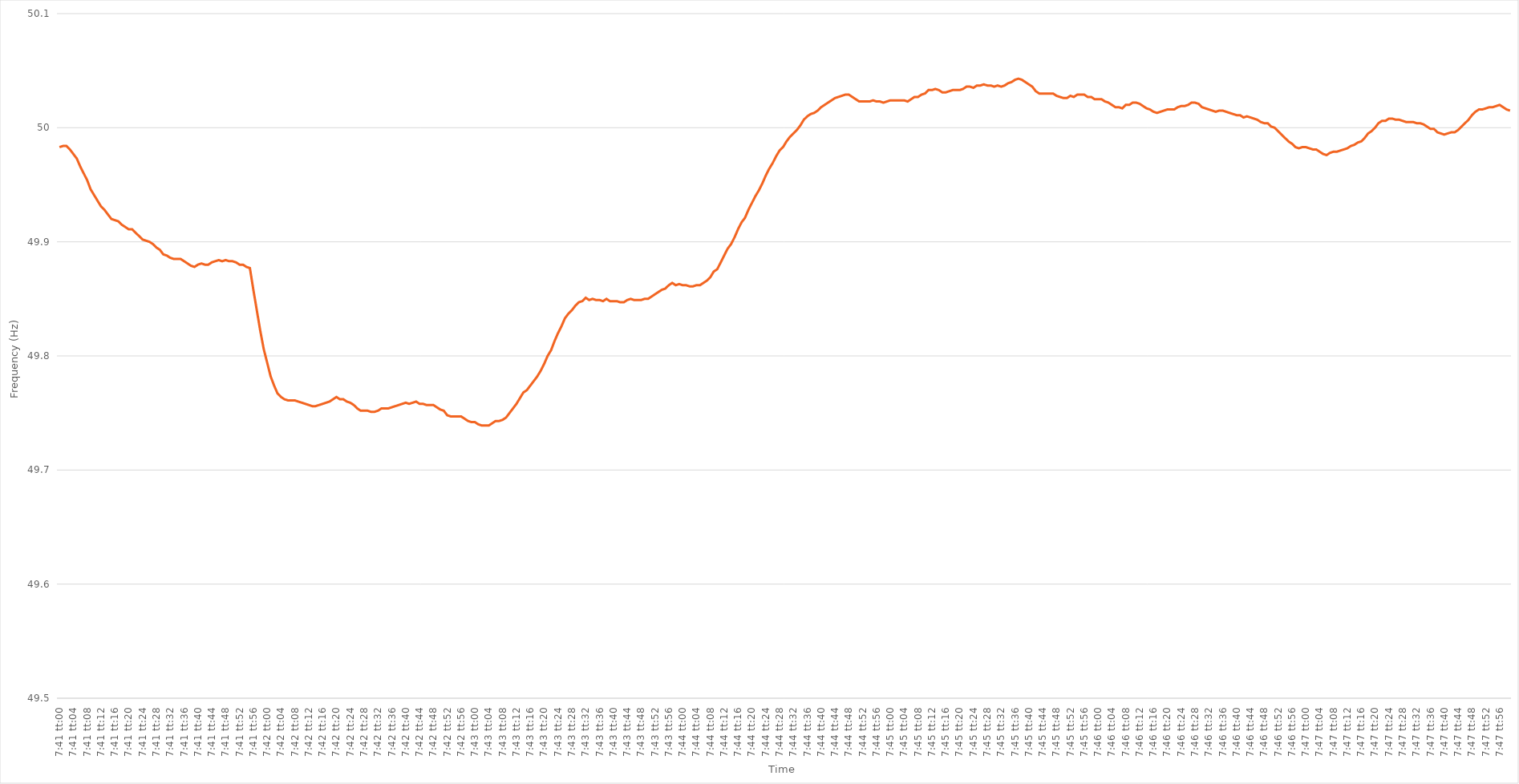
| Category | Series 0 |
|---|---|
| 0.3201388888888889 | 49.983 |
| 0.32015046296296296 | 49.984 |
| 0.32016203703703705 | 49.984 |
| 0.3201736111111111 | 49.981 |
| 0.3201851851851852 | 49.977 |
| 0.3201967592592592 | 49.973 |
| 0.3202083333333334 | 49.966 |
| 0.3202199074074074 | 49.96 |
| 0.32023148148148145 | 49.954 |
| 0.32024305555555554 | 49.946 |
| 0.32025462962962964 | 49.941 |
| 0.3202662037037037 | 49.936 |
| 0.3202777777777778 | 49.931 |
| 0.32028935185185187 | 49.928 |
| 0.3203009259259259 | 49.924 |
| 0.3203125 | 49.92 |
| 0.3203240740740741 | 49.919 |
| 0.32033564814814813 | 49.918 |
| 0.3203472222222222 | 49.915 |
| 0.3203587962962963 | 49.913 |
| 0.32037037037037036 | 49.911 |
| 0.32038194444444446 | 49.911 |
| 0.32039351851851855 | 49.908 |
| 0.3204050925925926 | 49.905 |
| 0.3204166666666666 | 49.902 |
| 0.3204282407407408 | 49.901 |
| 0.3204398148148148 | 49.9 |
| 0.3204513888888889 | 49.898 |
| 0.32046296296296295 | 49.895 |
| 0.32047453703703704 | 49.893 |
| 0.3204861111111111 | 49.889 |
| 0.3204976851851852 | 49.888 |
| 0.32050925925925927 | 49.886 |
| 0.3205208333333333 | 49.885 |
| 0.3205324074074074 | 49.885 |
| 0.3205439814814815 | 49.885 |
| 0.32055555555555554 | 49.883 |
| 0.32056712962962963 | 49.881 |
| 0.3205787037037037 | 49.879 |
| 0.32059027777777777 | 49.878 |
| 0.32060185185185186 | 49.88 |
| 0.32061342592592595 | 49.881 |
| 0.320625 | 49.88 |
| 0.3206365740740741 | 49.88 |
| 0.3206481481481482 | 49.882 |
| 0.3206597222222222 | 49.883 |
| 0.3206712962962963 | 49.884 |
| 0.32068287037037035 | 49.883 |
| 0.32069444444444445 | 49.884 |
| 0.3207060185185185 | 49.883 |
| 0.3207175925925926 | 49.883 |
| 0.3207291666666667 | 49.882 |
| 0.3207407407407407 | 49.88 |
| 0.3207523148148148 | 49.88 |
| 0.3207638888888889 | 49.878 |
| 0.32077546296296294 | 49.877 |
| 0.32078703703703704 | 49.858 |
| 0.32079861111111113 | 49.84 |
| 0.32081018518518517 | 49.822 |
| 0.32082175925925926 | 49.806 |
| 0.32083333333333336 | 49.794 |
| 0.3208449074074074 | 49.782 |
| 0.3208564814814815 | 49.774 |
| 0.3208680555555556 | 49.767 |
| 0.3208796296296296 | 49.764 |
| 0.3208912037037037 | 49.762 |
| 0.32090277777777776 | 49.761 |
| 0.32091435185185185 | 49.761 |
| 0.3209259259259259 | 49.761 |
| 0.3209375 | 49.76 |
| 0.3209490740740741 | 49.759 |
| 0.3209606481481481 | 49.758 |
| 0.3209722222222222 | 49.757 |
| 0.3209837962962963 | 49.756 |
| 0.32099537037037035 | 49.756 |
| 0.32100694444444444 | 49.757 |
| 0.32101851851851854 | 49.758 |
| 0.3210300925925926 | 49.759 |
| 0.32104166666666667 | 49.76 |
| 0.32105324074074076 | 49.762 |
| 0.3210648148148148 | 49.764 |
| 0.3210763888888889 | 49.762 |
| 0.321087962962963 | 49.762 |
| 0.32109953703703703 | 49.76 |
| 0.3211111111111111 | 49.759 |
| 0.32112268518518516 | 49.757 |
| 0.32113425925925926 | 49.754 |
| 0.3211458333333333 | 49.752 |
| 0.32115740740740745 | 49.752 |
| 0.3211689814814815 | 49.752 |
| 0.3211805555555555 | 49.751 |
| 0.3211921296296296 | 49.751 |
| 0.3212037037037037 | 49.752 |
| 0.32121527777777775 | 49.754 |
| 0.32122685185185185 | 49.754 |
| 0.32123842592592594 | 49.754 |
| 0.32125 | 49.755 |
| 0.3212615740740741 | 49.756 |
| 0.32127314814814817 | 49.757 |
| 0.3212847222222222 | 49.758 |
| 0.3212962962962963 | 49.759 |
| 0.3213078703703704 | 49.758 |
| 0.32131944444444444 | 49.759 |
| 0.32133101851851853 | 49.76 |
| 0.3213425925925926 | 49.758 |
| 0.32135416666666666 | 49.758 |
| 0.3213657407407407 | 49.757 |
| 0.32137731481481485 | 49.757 |
| 0.3213888888888889 | 49.757 |
| 0.321400462962963 | 49.755 |
| 0.321412037037037 | 49.753 |
| 0.3214236111111111 | 49.752 |
| 0.32143518518518516 | 49.748 |
| 0.32144675925925925 | 49.747 |
| 0.32145833333333335 | 49.747 |
| 0.3214699074074074 | 49.747 |
| 0.3214814814814815 | 49.747 |
| 0.3214930555555556 | 49.745 |
| 0.3215046296296296 | 49.743 |
| 0.3215162037037037 | 49.742 |
| 0.3215277777777778 | 49.742 |
| 0.32153935185185184 | 49.74 |
| 0.32155092592592593 | 49.739 |
| 0.32156250000000003 | 49.739 |
| 0.32157407407407407 | 49.739 |
| 0.32158564814814816 | 49.741 |
| 0.32159722222222226 | 49.743 |
| 0.3216087962962963 | 49.743 |
| 0.3216203703703704 | 49.744 |
| 0.32163194444444443 | 49.746 |
| 0.3216435185185185 | 49.75 |
| 0.32165509259259256 | 49.754 |
| 0.32166666666666666 | 49.758 |
| 0.32167824074074075 | 49.763 |
| 0.3216898148148148 | 49.768 |
| 0.3217013888888889 | 49.77 |
| 0.321712962962963 | 49.774 |
| 0.321724537037037 | 49.778 |
| 0.3217361111111111 | 49.782 |
| 0.3217476851851852 | 49.787 |
| 0.32175925925925924 | 49.793 |
| 0.32177083333333334 | 49.8 |
| 0.32178240740740743 | 49.805 |
| 0.3217939814814815 | 49.813 |
| 0.32180555555555557 | 49.82 |
| 0.32181712962962966 | 49.826 |
| 0.3218287037037037 | 49.833 |
| 0.3218402777777778 | 49.837 |
| 0.32185185185185183 | 49.84 |
| 0.32186342592592593 | 49.844 |
| 0.32187499999999997 | 49.847 |
| 0.32188657407407406 | 49.848 |
| 0.32189814814814816 | 49.851 |
| 0.3219097222222222 | 49.849 |
| 0.3219212962962963 | 49.85 |
| 0.3219328703703704 | 49.849 |
| 0.3219444444444444 | 49.849 |
| 0.3219560185185185 | 49.848 |
| 0.3219675925925926 | 49.85 |
| 0.32197916666666665 | 49.848 |
| 0.32199074074074074 | 49.848 |
| 0.32200231481481484 | 49.848 |
| 0.3220138888888889 | 49.847 |
| 0.32202546296296297 | 49.847 |
| 0.32203703703703707 | 49.849 |
| 0.3220486111111111 | 49.85 |
| 0.3220601851851852 | 49.849 |
| 0.32207175925925924 | 49.849 |
| 0.32208333333333333 | 49.849 |
| 0.32209490740740737 | 49.85 |
| 0.3221064814814815 | 49.85 |
| 0.32211805555555556 | 49.852 |
| 0.3221296296296296 | 49.854 |
| 0.3221412037037037 | 49.856 |
| 0.3221527777777778 | 49.858 |
| 0.3221643518518518 | 49.859 |
| 0.3221759259259259 | 49.862 |
| 0.3221875 | 49.864 |
| 0.32219907407407405 | 49.862 |
| 0.32221064814814815 | 49.863 |
| 0.32222222222222224 | 49.862 |
| 0.3222337962962963 | 49.862 |
| 0.3222453703703704 | 49.861 |
| 0.32225694444444447 | 49.861 |
| 0.3222685185185185 | 49.862 |
| 0.3222800925925926 | 49.862 |
| 0.3222916666666667 | 49.864 |
| 0.32230324074074074 | 49.866 |
| 0.3223148148148148 | 49.869 |
| 0.3223263888888889 | 49.874 |
| 0.32233796296296297 | 49.876 |
| 0.322349537037037 | 49.882 |
| 0.3223611111111111 | 49.888 |
| 0.3223726851851852 | 49.894 |
| 0.32238425925925923 | 49.898 |
| 0.3223958333333333 | 49.904 |
| 0.3224074074074074 | 49.911 |
| 0.32241898148148146 | 49.917 |
| 0.32243055555555555 | 49.921 |
| 0.32244212962962965 | 49.928 |
| 0.3224537037037037 | 49.934 |
| 0.3224652777777778 | 49.94 |
| 0.3224768518518519 | 49.945 |
| 0.3224884259259259 | 49.951 |
| 0.3225 | 49.958 |
| 0.3225115740740741 | 49.964 |
| 0.32252314814814814 | 49.969 |
| 0.32253472222222224 | 49.975 |
| 0.32254629629629633 | 49.98 |
| 0.32255787037037037 | 49.983 |
| 0.32256944444444446 | 49.988 |
| 0.3225810185185185 | 49.992 |
| 0.3225925925925926 | 49.995 |
| 0.32260416666666664 | 49.998 |
| 0.32261574074074073 | 50.002 |
| 0.3226273148148148 | 50.007 |
| 0.32263888888888886 | 50.01 |
| 0.32265046296296296 | 50.012 |
| 0.32266203703703705 | 50.013 |
| 0.3226736111111111 | 50.015 |
| 0.3226851851851852 | 50.018 |
| 0.3226967592592593 | 50.02 |
| 0.3227083333333333 | 50.022 |
| 0.3227199074074074 | 50.024 |
| 0.3227314814814815 | 50.026 |
| 0.32274305555555555 | 50.027 |
| 0.32275462962962964 | 50.028 |
| 0.32276620370370374 | 50.029 |
| 0.3227777777777778 | 50.029 |
| 0.32278935185185187 | 50.027 |
| 0.3228009259259259 | 50.025 |
| 0.3228125 | 50.023 |
| 0.32282407407407404 | 50.023 |
| 0.32283564814814814 | 50.023 |
| 0.32284722222222223 | 50.023 |
| 0.32285879629629627 | 50.024 |
| 0.32287037037037036 | 50.023 |
| 0.32288194444444446 | 50.023 |
| 0.3228935185185185 | 50.022 |
| 0.3229050925925926 | 50.023 |
| 0.3229166666666667 | 50.024 |
| 0.3229282407407407 | 50.024 |
| 0.3229398148148148 | 50.024 |
| 0.3229513888888889 | 50.024 |
| 0.32296296296296295 | 50.024 |
| 0.32297453703703705 | 50.023 |
| 0.32298611111111114 | 50.025 |
| 0.3229976851851852 | 50.027 |
| 0.3230092592592593 | 50.027 |
| 0.3230208333333333 | 50.029 |
| 0.3230324074074074 | 50.03 |
| 0.32304398148148145 | 50.033 |
| 0.3230555555555556 | 50.033 |
| 0.32306712962962963 | 50.034 |
| 0.3230787037037037 | 50.033 |
| 0.32309027777777777 | 50.031 |
| 0.32310185185185186 | 50.031 |
| 0.3231134259259259 | 50.032 |
| 0.323125 | 50.033 |
| 0.3231365740740741 | 50.033 |
| 0.32314814814814813 | 50.033 |
| 0.3231597222222222 | 50.034 |
| 0.3231712962962963 | 50.036 |
| 0.32318287037037036 | 50.036 |
| 0.32319444444444445 | 50.035 |
| 0.32320601851851855 | 50.037 |
| 0.3232175925925926 | 50.037 |
| 0.3232291666666667 | 50.038 |
| 0.3232407407407408 | 50.037 |
| 0.3232523148148148 | 50.037 |
| 0.32326388888888885 | 50.036 |
| 0.323275462962963 | 50.037 |
| 0.32328703703703704 | 50.036 |
| 0.3232986111111111 | 50.037 |
| 0.3233101851851852 | 50.039 |
| 0.32332175925925927 | 50.04 |
| 0.3233333333333333 | 50.042 |
| 0.3233449074074074 | 50.043 |
| 0.3233564814814815 | 50.042 |
| 0.32336805555555553 | 50.04 |
| 0.32337962962962963 | 50.038 |
| 0.3233912037037037 | 50.036 |
| 0.32340277777777776 | 50.032 |
| 0.32341435185185186 | 50.03 |
| 0.32342592592592595 | 50.03 |
| 0.3234375 | 50.03 |
| 0.3234490740740741 | 50.03 |
| 0.3234606481481482 | 50.03 |
| 0.3234722222222222 | 50.028 |
| 0.3234837962962963 | 50.027 |
| 0.3234953703703704 | 50.026 |
| 0.32350694444444444 | 50.026 |
| 0.32351851851851854 | 50.028 |
| 0.3235300925925926 | 50.027 |
| 0.32354166666666667 | 50.029 |
| 0.3235532407407407 | 50.029 |
| 0.3235648148148148 | 50.029 |
| 0.3235763888888889 | 50.027 |
| 0.32358796296296294 | 50.027 |
| 0.32359953703703703 | 50.025 |
| 0.3236111111111111 | 50.025 |
| 0.32362268518518517 | 50.025 |
| 0.32363425925925926 | 50.023 |
| 0.32364583333333335 | 50.022 |
| 0.3236574074074074 | 50.02 |
| 0.3236689814814815 | 50.018 |
| 0.3236805555555556 | 50.018 |
| 0.3236921296296296 | 50.017 |
| 0.3237037037037037 | 50.02 |
| 0.3237152777777778 | 50.02 |
| 0.32372685185185185 | 50.022 |
| 0.32373842592592594 | 50.022 |
| 0.32375 | 50.021 |
| 0.3237615740740741 | 50.019 |
| 0.3237731481481481 | 50.017 |
| 0.3237847222222222 | 50.016 |
| 0.3237962962962963 | 50.014 |
| 0.32380787037037034 | 50.013 |
| 0.32381944444444444 | 50.014 |
| 0.32383101851851853 | 50.015 |
| 0.32384259259259257 | 50.016 |
| 0.32385416666666667 | 50.016 |
| 0.32386574074074076 | 50.016 |
| 0.3238773148148148 | 50.018 |
| 0.3238888888888889 | 50.019 |
| 0.323900462962963 | 50.019 |
| 0.323912037037037 | 50.02 |
| 0.3239236111111111 | 50.022 |
| 0.3239351851851852 | 50.022 |
| 0.32394675925925925 | 50.021 |
| 0.32395833333333335 | 50.018 |
| 0.3239699074074074 | 50.017 |
| 0.3239814814814815 | 50.016 |
| 0.3239930555555555 | 50.015 |
| 0.32400462962962967 | 50.014 |
| 0.3240162037037037 | 50.015 |
| 0.32402777777777775 | 50.015 |
| 0.32403935185185184 | 50.014 |
| 0.32405092592592594 | 50.013 |
| 0.3240625 | 50.012 |
| 0.32407407407407407 | 50.011 |
| 0.32408564814814816 | 50.011 |
| 0.3240972222222222 | 50.009 |
| 0.3241087962962963 | 50.01 |
| 0.3241203703703704 | 50.009 |
| 0.32413194444444443 | 50.008 |
| 0.3241435185185185 | 50.007 |
| 0.3241550925925926 | 50.005 |
| 0.32416666666666666 | 50.004 |
| 0.32417824074074075 | 50.004 |
| 0.32418981481481485 | 50.001 |
| 0.3242013888888889 | 50 |
| 0.3242129629629629 | 49.997 |
| 0.3242245370370371 | 49.994 |
| 0.3242361111111111 | 49.991 |
| 0.32424768518518515 | 49.988 |
| 0.32425925925925925 | 49.986 |
| 0.32427083333333334 | 49.983 |
| 0.3242824074074074 | 49.982 |
| 0.3242939814814815 | 49.983 |
| 0.32430555555555557 | 49.983 |
| 0.3243171296296296 | 49.982 |
| 0.3243287037037037 | 49.981 |
| 0.3243402777777778 | 49.981 |
| 0.32435185185185184 | 49.979 |
| 0.32436342592592593 | 49.977 |
| 0.324375 | 49.976 |
| 0.32438657407407406 | 49.978 |
| 0.32439814814814816 | 49.979 |
| 0.32440972222222225 | 49.979 |
| 0.3244212962962963 | 49.98 |
| 0.32443287037037033 | 49.981 |
| 0.3244444444444445 | 49.982 |
| 0.3244560185185185 | 49.984 |
| 0.3244675925925926 | 49.985 |
| 0.32447916666666665 | 49.987 |
| 0.32449074074074075 | 49.988 |
| 0.3245023148148148 | 49.991 |
| 0.3245138888888889 | 49.995 |
| 0.324525462962963 | 49.997 |
| 0.324537037037037 | 50 |
| 0.3245486111111111 | 50.004 |
| 0.3245601851851852 | 50.006 |
| 0.32457175925925924 | 50.006 |
| 0.32458333333333333 | 50.008 |
| 0.32459490740740743 | 50.008 |
| 0.32460648148148147 | 50.007 |
| 0.32461805555555556 | 50.007 |
| 0.32462962962962966 | 50.006 |
| 0.3246412037037037 | 50.005 |
| 0.3246527777777778 | 50.005 |
| 0.3246643518518519 | 50.005 |
| 0.3246759259259259 | 50.004 |
| 0.3246875 | 50.004 |
| 0.32469907407407406 | 50.003 |
| 0.32471064814814815 | 50.001 |
| 0.3247222222222222 | 49.999 |
| 0.3247337962962963 | 49.999 |
| 0.3247453703703704 | 49.996 |
| 0.3247569444444444 | 49.995 |
| 0.3247685185185185 | 49.994 |
| 0.3247800925925926 | 49.995 |
| 0.32479166666666665 | 49.996 |
| 0.32480324074074074 | 49.996 |
| 0.32481481481481483 | 49.998 |
| 0.3248263888888889 | 50.001 |
| 0.32483796296296297 | 50.004 |
| 0.32484953703703706 | 50.007 |
| 0.3248611111111111 | 50.011 |
| 0.3248726851851852 | 50.014 |
| 0.3248842592592593 | 50.016 |
| 0.32489583333333333 | 50.016 |
| 0.3249074074074074 | 50.017 |
| 0.32491898148148146 | 50.018 |
| 0.32493055555555556 | 50.018 |
| 0.3249421296296296 | 50.019 |
| 0.3249537037037037 | 50.02 |
| 0.3249652777777778 | 50.018 |
| 0.3249768518518518 | 50.016 |
| 0.3249884259259259 | 50.015 |